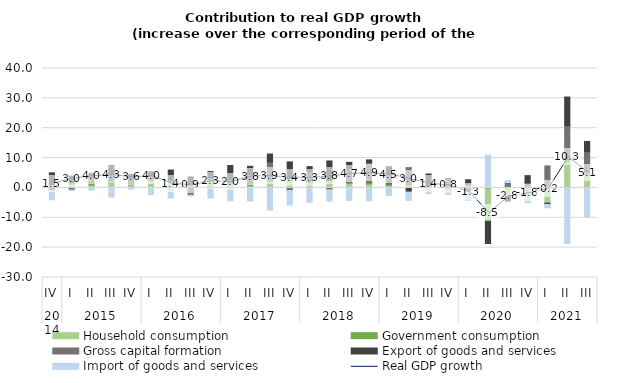
| Category | Household consumption | Government consumption | Gross capital formation | Export of goods and services | Import of goods and services |
|---|---|---|---|---|---|
| 0 | 0.515 | 0.633 | -0.91 | 3.908 | -3.031 |
| 1 | 1.307 | 0.595 | -0.669 | 2.073 | -0.01 |
| 2 | 0.953 | 0.546 | 1.992 | 1.375 | -0.729 |
| 3 | 2.017 | 0.495 | 2.099 | 2.712 | -3.08 |
| 4 | 1.043 | 0.366 | 1.951 | 1.141 | -0.426 |
| 5 | 2.462 | 0.323 | 1.178 | 1.435 | -2.222 |
| 6 | 2.154 | 0.314 | -0.053 | 3.526 | -3.287 |
| 7 | 0.886 | 0.38 | -2.458 | 2.437 | -0.201 |
| 8 | 2.234 | 0.537 | 0.637 | 2.082 | -3.345 |
| 9 | 1.208 | 0.599 | 1.204 | 4.488 | -4.355 |
| 10 | 0.7 | 0.678 | 3.07 | 2.789 | -4.355 |
| 11 | 2.05 | 0.652 | 5.963 | 2.693 | -7.464 |
| 12 | 2.609 | 0.536 | -0.855 | 5.574 | -4.887 |
| 13 | 1.817 | 0.427 | 3.167 | 1.709 | -4.827 |
| 14 | 2.277 | 0.33 | -0.627 | 6.423 | -3.773 |
| 15 | 1.506 | 0.316 | 4.54 | 2.186 | -4.184 |
| 16 | 1.352 | 0.386 | 6.728 | 0.919 | -4.305 |
| 17 | 0.782 | 0.499 | 3.207 | 2.635 | -2.555 |
| 18 | 0.72 | 0.592 | 5.485 | -1.383 | -2.799 |
| 19 | 0.095 | 0.624 | 0.131 | 3.824 | -1.944 |
| 20 | -1.052 | 0.582 | 2.368 | 0.187 | -1.112 |
| 21 | 0.734 | 0.508 | -1.301 | 1.496 | -2.781 |
| 22 | -10.528 | 0.434 | -0.353 | -7.734 | 10.532 |
| 23 | -2.723 | 0.48 | 1.333 | -1.703 | 0.63 |
| 24 | -3.039 | 0.58 | 1.191 | 2.349 | -1.899 |
| 25 | -5.09 | 0.713 | 6.658 | -0.431 | -1.125 |
| 26 | 8.67 | 0.951 | 11.219 | 9.604 | -18.6 |
| 27 | 4.379 | 0.929 | 6.828 | 3.419 | -9.762 |